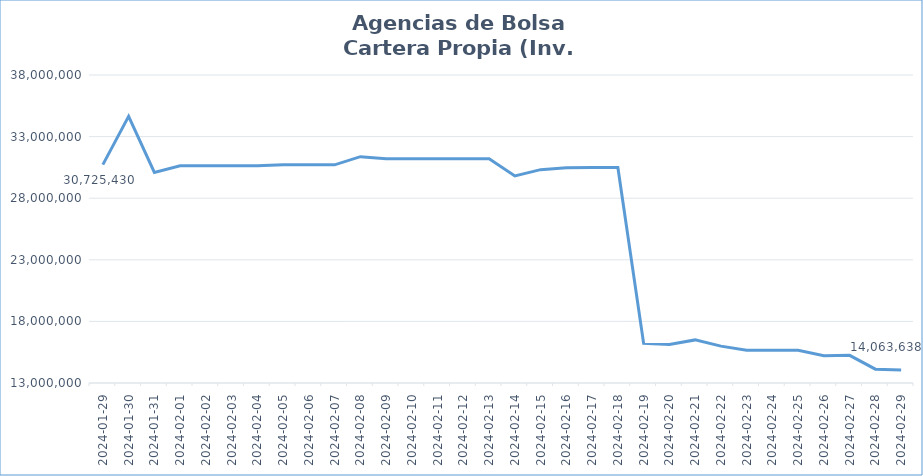
| Category | INV. LOCALES |
|---|---|
| 2024-01-29 | 30725429.72 |
| 2024-01-30 | 34651027.38 |
| 2024-01-31 | 30094076.87 |
| 2024-02-01 | 30634976.64 |
| 2024-02-02 | 30632349.97 |
| 2024-02-03 | 30635802.78 |
| 2024-02-04 | 30639284.41 |
| 2024-02-05 | 30705225.15 |
| 2024-02-06 | 30708808.91 |
| 2024-02-07 | 30705397.42 |
| 2024-02-08 | 31372617.96 |
| 2024-02-09 | 31195042.75 |
| 2024-02-10 | 31195527.19 |
| 2024-02-11 | 31198929.54 |
| 2024-02-12 | 31202363.54 |
| 2024-02-13 | 31205801.6 |
| 2024-02-14 | 29803030.18 |
| 2024-02-15 | 30317604.68 |
| 2024-02-16 | 30479217.65 |
| 2024-02-17 | 30482598.08 |
| 2024-02-18 | 30485965.93 |
| 2024-02-19 | 16216346.76 |
| 2024-02-20 | 16120606.78 |
| 2024-02-21 | 16498382.77 |
| 2024-02-22 | 15993387.83 |
| 2024-02-23 | 15650276.87 |
| 2024-02-24 | 15651341.01 |
| 2024-02-25 | 15652430.03 |
| 2024-02-26 | 15219129.73 |
| 2024-02-27 | 15243041.27 |
| 2024-02-28 | 14121906.69 |
| 2024-02-29 | 14063637.84 |